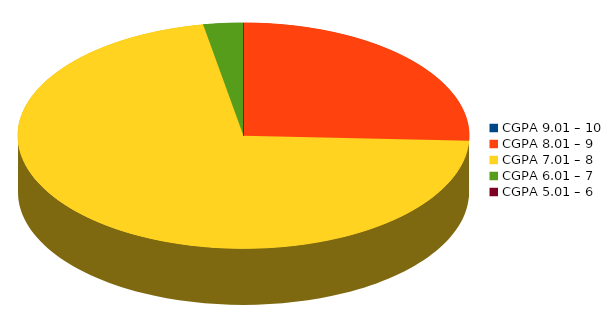
| Category | Number of students |
|---|---|
| CGPA 9.01 – 10 | 0 |
| CGPA 8.01 – 9 | 9 |
| CGPA 7.01 – 8 | 25 |
| CGPA 6.01 – 7 | 1 |
| CGPA 5.01 – 6 | 0 |